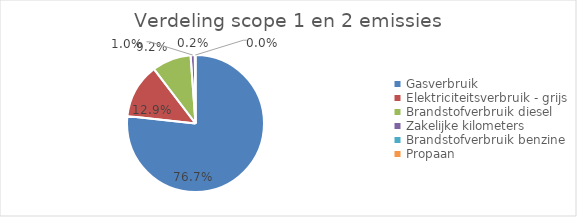
| Category | categorie |
|---|---|
| Gasverbruik | 3723.143 |
| Elektriciteitsverbruik - grijs | 626.073 |
| Brandstofverbruik diesel | 447.893 |
| Zakelijke kilometers | 48.109 |
| Brandstofverbruik benzine | 6.451 |
| Propaan | 1.157 |